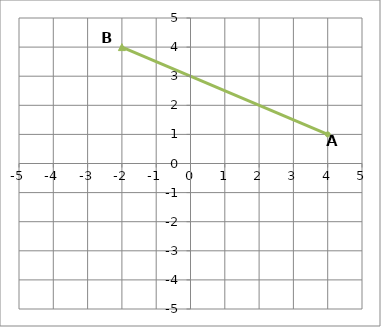
| Category | Координаты точек (на плоскости) |
|---|---|
| 4.0 | 1 |
| -2.0 | 4 |